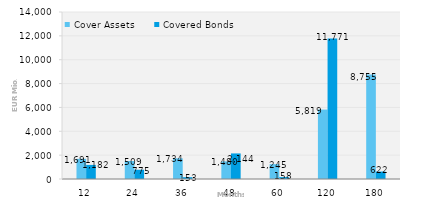
| Category | Cover Assets | Covered Bonds |
|---|---|---|
| 12.0 | 1690.58 | 1181.505 |
| 24.0 | 1509.348 | 775 |
| 36.0 | 1733.578 | 152.5 |
| 48.0 | 1479.812 | 2144 |
| 60.0 | 1244.583 | 158.178 |
| 120.0 | 5818.697 | 11771.336 |
| 180.0 | 8755.365 | 622.099 |